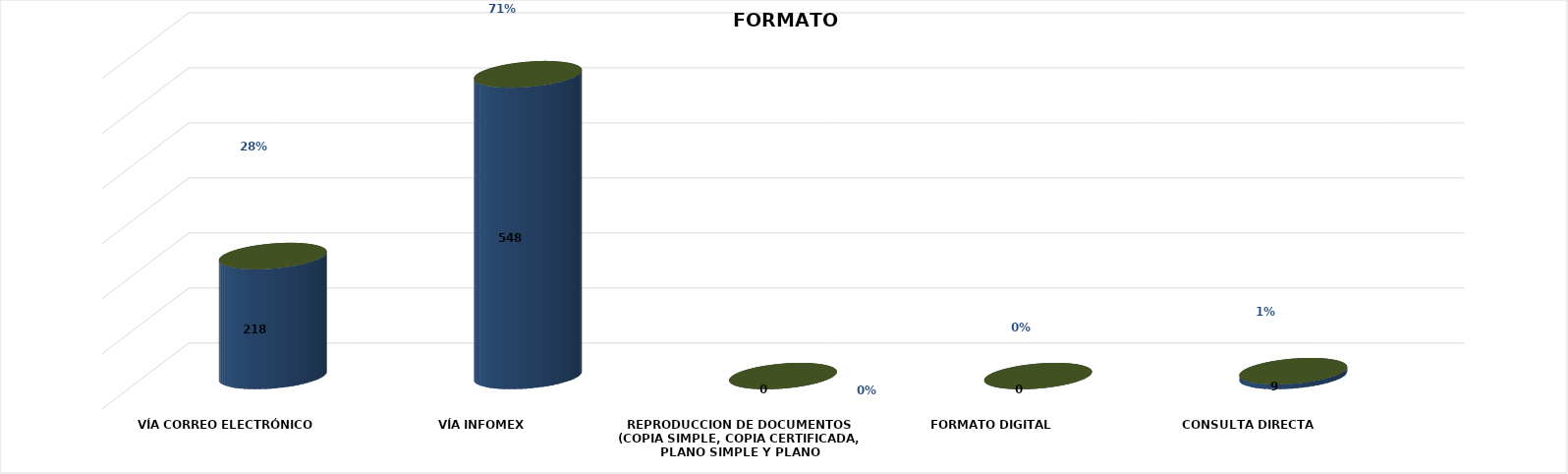
| Category | Series 0 | Series 1 | Series 2 | Series 3 | Series 4 |
|---|---|---|---|---|---|
| VÍA CORREO ELECTRÓNICO |  |  |  | 218 | 0.281 |
| VÍA INFOMEX |  |  |  | 548 | 0.707 |
| REPRODUCCION DE DOCUMENTOS (COPIA SIMPLE, COPIA CERTIFICADA, PLANO SIMPLE Y PLANO CERTIFICADO) |  |  |  | 0 | 0 |
| FORMATO DIGITAL |  |  |  | 0 | 0 |
| CONSULTA DIRECTA |  |  |  | 9 | 0.012 |